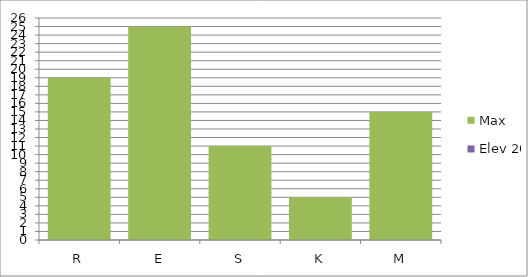
| Category | Max | Elev 20 |
|---|---|---|
| R | 19 | 0 |
| E | 25 | 0 |
| S | 11 | 0 |
| K | 5 | 0 |
| M | 15 | 0 |